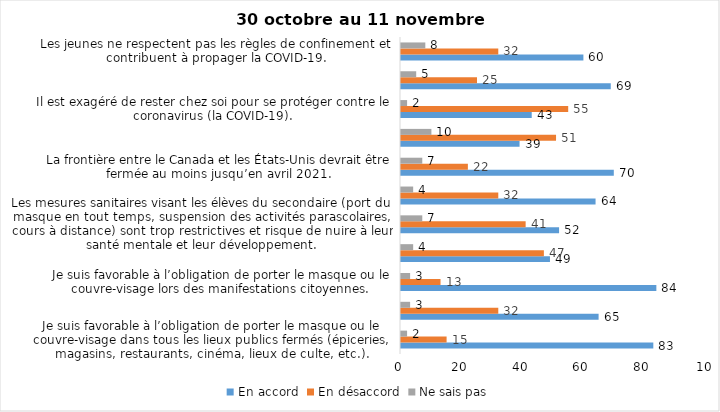
| Category | En accord | En désaccord | Ne sais pas |
|---|---|---|---|
| Je suis favorable à l’obligation de porter le masque ou le couvre-visage dans tous les lieux publics fermés (épiceries, magasins, restaurants, cinéma, lieux de culte, etc.). | 83 | 15 | 2 |
| C’est une bonne chose que les policiers puissent donner facilement des contraventions aux gens qui ne respectent pas les mesures pour prévenir le coronavirus (la COVID-19). | 65 | 32 | 3 |
| Je suis favorable à l’obligation de porter le masque ou le couvre-visage lors des manifestations citoyennes. | 84 | 13 | 3 |
| C’est une bonne chose d’arrêter les activités sportives de groupe (ex. hockey, soccer, yoga, etc.) et de fermer les centres d’entraînement (gyms) dans les zones rouges. | 49 | 47 | 4 |
| Les mesures sanitaires visant les élèves du secondaire (port du masque en tout temps, suspension des activités parascolaires, cours à distance) sont trop restrictives et risque de nuire à leur santé mentale et leur développement. | 52 | 41 | 7 |
| Je suis favorable à l’obligation de porter le masque ou le couvre-visage en tout temps pour les élèves au secondaire. | 64 | 32 | 4 |
| La frontière entre le Canada et les États-Unis devrait être fermée au moins jusqu’en avril 2021. | 70 | 22 | 7 |
| Le gouvernement et les médias exagèrent par rapport au coronavirus (la COVID-19). | 39 | 51 | 10 |
| Il est exagéré de rester chez soi pour se protéger contre le coronavirus (la COVID-19). | 43 | 55 | 2 |
| J’ai peur que le système de santé soit débordé par les cas de COVID-19 suite au «déconfinement». | 69 | 25 | 5 |
| Les jeunes ne respectent pas les règles de confinement et contribuent à propager la COVID-19. | 60 | 32 | 8 |